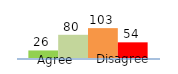
| Category | Series 0 | Series 1 | Series 2 | Series 3 |
|---|---|---|---|---|
| 0 | 26 | 80 | 103 | 54 |